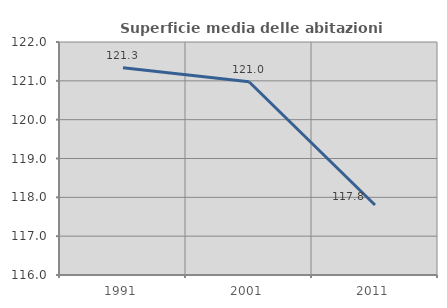
| Category | Superficie media delle abitazioni occupate |
|---|---|
| 1991.0 | 121.335 |
| 2001.0 | 120.978 |
| 2011.0 | 117.803 |